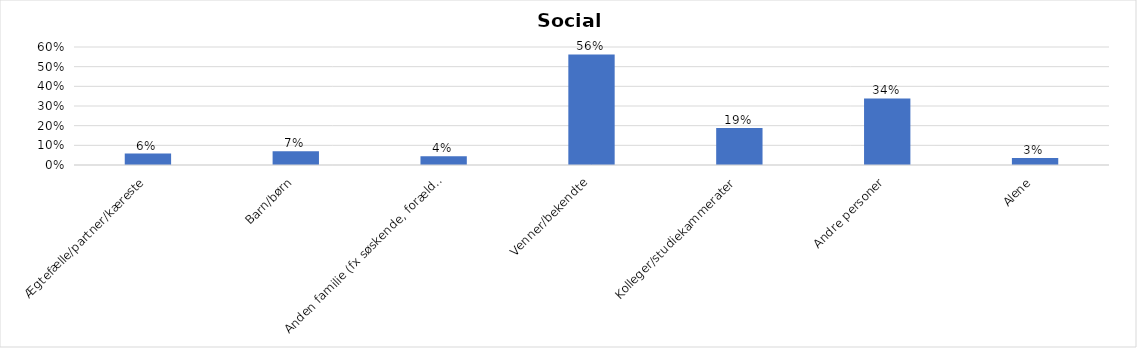
| Category | % |
|---|---|
| Ægtefælle/partner/kæreste | 0.058 |
| Barn/børn | 0.07 |
| Anden familie (fx søskende, forældre) | 0.045 |
| Venner/bekendte | 0.562 |
| Kolleger/studiekammerater | 0.188 |
| Andre personer | 0.338 |
| Alene | 0.035 |